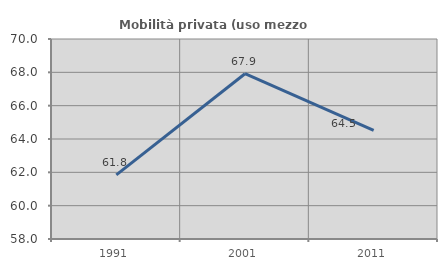
| Category | Mobilità privata (uso mezzo privato) |
|---|---|
| 1991.0 | 61.844 |
| 2001.0 | 67.915 |
| 2011.0 | 64.524 |